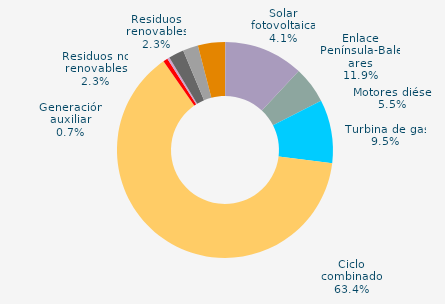
| Category | Series 0 |
|---|---|
| Carbón | 0 |
| Motores diésel | 5.502 |
| Turbina de gas | 9.493 |
| Ciclo combinado | 63.417 |
| Generación auxiliar | 0.687 |
| Cogeneración | 0.343 |
| Residuos no renovables | 2.284 |
| Residuos renovables | 2.284 |
| Eólica | 0.002 |
| Solar fotovoltaica | 4.095 |
| Otras renovables | 0.012 |
| Enlace Península-Baleares | 11.882 |